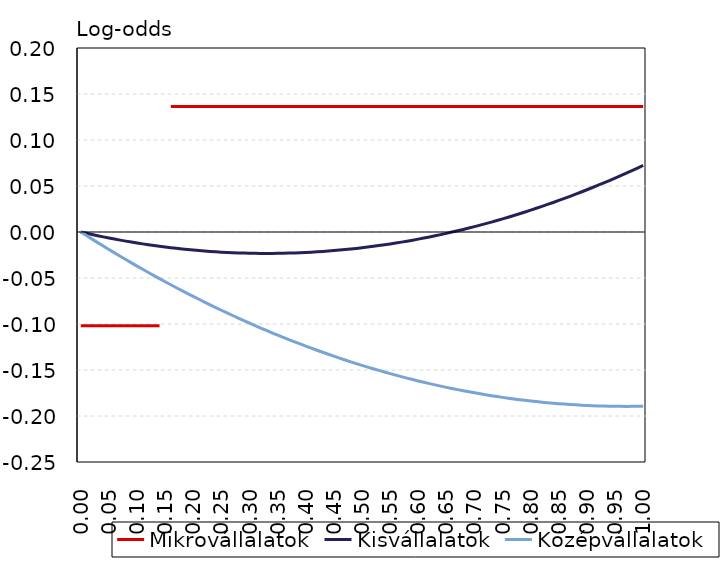
| Category | Mikrovállalatok | Kisvállalatok | Középvállalatok |
|---|---|---|---|
| 0.0 | -0.102 | 0 | 0 |
| 0.01 | -0.102 | -0.001 | -0.004 |
| 0.02 | -0.102 | -0.003 | -0.008 |
| 0.03 | -0.102 | -0.004 | -0.012 |
| 0.04 | -0.102 | -0.005 | -0.015 |
| 0.05 | -0.102 | -0.007 | -0.019 |
| 0.0600000000000001 | -0.102 | -0.008 | -0.023 |
| 0.0700000000000001 | -0.102 | -0.009 | -0.026 |
| 0.0800000000000001 | -0.102 | -0.01 | -0.03 |
| 0.0900000000000001 | -0.102 | -0.011 | -0.034 |
| 0.1 | -0.102 | -0.012 | -0.037 |
| 0.11 | -0.102 | -0.013 | -0.041 |
| 0.12 | -0.102 | -0.014 | -0.044 |
| 0.13 | -0.102 | -0.015 | -0.047 |
| 0.14 | -0.102 | -0.016 | -0.051 |
| 0.15 | 0.136 | -0.016 | -0.054 |
| 0.16 | 0.136 | -0.017 | -0.057 |
| 0.17 | 0.136 | -0.018 | -0.061 |
| 0.18 | 0.136 | -0.018 | -0.064 |
| 0.19 | 0.136 | -0.019 | -0.067 |
| 0.2 | 0.136 | -0.02 | -0.07 |
| 0.21 | 0.136 | -0.02 | -0.073 |
| 0.22 | 0.136 | -0.021 | -0.076 |
| 0.23 | 0.136 | -0.021 | -0.079 |
| 0.24 | 0.136 | -0.022 | -0.082 |
| 0.25 | 0.136 | -0.022 | -0.085 |
| 0.26 | 0.136 | -0.022 | -0.088 |
| 0.27 | 0.136 | -0.022 | -0.091 |
| 0.28 | 0.136 | -0.023 | -0.094 |
| 0.29 | 0.136 | -0.023 | -0.096 |
| 0.3 | 0.136 | -0.023 | -0.099 |
| 0.31 | 0.136 | -0.023 | -0.102 |
| 0.32 | 0.136 | -0.023 | -0.104 |
| 0.33 | 0.136 | -0.023 | -0.107 |
| 0.34 | 0.136 | -0.023 | -0.11 |
| 0.35 | 0.136 | -0.023 | -0.112 |
| 0.36 | 0.136 | -0.023 | -0.115 |
| 0.37 | 0.136 | -0.023 | -0.117 |
| 0.38 | 0.136 | -0.023 | -0.119 |
| 0.39 | 0.136 | -0.022 | -0.122 |
| 0.4 | 0.136 | -0.022 | -0.124 |
| 0.41 | 0.136 | -0.022 | -0.126 |
| 0.42 | 0.136 | -0.022 | -0.129 |
| 0.43 | 0.136 | -0.021 | -0.131 |
| 0.44 | 0.136 | -0.021 | -0.133 |
| 0.45 | 0.136 | -0.02 | -0.135 |
| 0.46 | 0.136 | -0.02 | -0.137 |
| 0.47 | 0.136 | -0.019 | -0.139 |
| 0.48 | 0.136 | -0.018 | -0.141 |
| 0.49 | 0.136 | -0.018 | -0.143 |
| 0.5 | 0.136 | -0.017 | -0.145 |
| 0.51 | 0.136 | -0.016 | -0.147 |
| 0.52 | 0.136 | -0.016 | -0.149 |
| 0.53 | 0.136 | -0.015 | -0.15 |
| 0.54 | 0.136 | -0.014 | -0.152 |
| 0.55 | 0.136 | -0.013 | -0.154 |
| 0.56 | 0.136 | -0.012 | -0.156 |
| 0.57 | 0.136 | -0.011 | -0.157 |
| 0.58 | 0.136 | -0.01 | -0.159 |
| 0.59 | 0.136 | -0.009 | -0.16 |
| 0.6 | 0.136 | -0.008 | -0.162 |
| 0.61 | 0.136 | -0.007 | -0.163 |
| 0.62 | 0.136 | -0.005 | -0.165 |
| 0.63 | 0.136 | -0.004 | -0.166 |
| 0.64 | 0.136 | -0.003 | -0.168 |
| 0.65 | 0.136 | -0.001 | -0.169 |
| 0.66 | 0.136 | 0 | -0.17 |
| 0.67 | 0.136 | 0.001 | -0.171 |
| 0.68 | 0.136 | 0.003 | -0.173 |
| 0.69 | 0.136 | 0.004 | -0.174 |
| 0.7 | 0.136 | 0.006 | -0.175 |
| 0.71 | 0.136 | 0.007 | -0.176 |
| 0.72 | 0.136 | 0.009 | -0.177 |
| 0.73 | 0.136 | 0.011 | -0.178 |
| 0.74 | 0.136 | 0.013 | -0.179 |
| 0.75 | 0.136 | 0.014 | -0.18 |
| 0.76 | 0.136 | 0.016 | -0.181 |
| 0.77 | 0.136 | 0.018 | -0.181 |
| 0.78 | 0.136 | 0.02 | -0.182 |
| 0.79 | 0.136 | 0.022 | -0.183 |
| 0.8 | 0.136 | 0.024 | -0.184 |
| 0.81 | 0.136 | 0.026 | -0.184 |
| 0.82 | 0.136 | 0.028 | -0.185 |
| 0.83 | 0.136 | 0.03 | -0.186 |
| 0.84 | 0.136 | 0.032 | -0.186 |
| 0.85 | 0.136 | 0.034 | -0.187 |
| 0.86 | 0.136 | 0.037 | -0.187 |
| 0.87 | 0.136 | 0.039 | -0.188 |
| 0.88 | 0.136 | 0.041 | -0.188 |
| 0.89 | 0.136 | 0.044 | -0.188 |
| 0.9 | 0.136 | 0.046 | -0.189 |
| 0.91 | 0.136 | 0.048 | -0.189 |
| 0.92 | 0.136 | 0.051 | -0.189 |
| 0.93 | 0.136 | 0.053 | -0.189 |
| 0.94 | 0.136 | 0.056 | -0.189 |
| 0.95 | 0.136 | 0.059 | -0.189 |
| 0.96 | 0.136 | 0.061 | -0.19 |
| 0.97 | 0.136 | 0.064 | -0.19 |
| 0.98 | 0.136 | 0.067 | -0.19 |
| 0.99 | 0.136 | 0.069 | -0.189 |
| 1.0 | 0.136 | 0.072 | -0.189 |